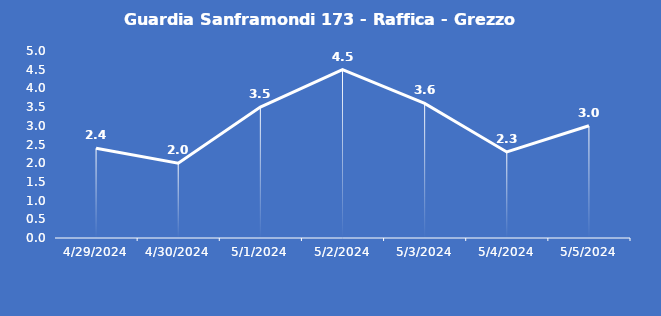
| Category | Guardia Sanframondi 173 - Raffica - Grezzo (m/s) |
|---|---|
| 4/29/24 | 2.4 |
| 4/30/24 | 2 |
| 5/1/24 | 3.5 |
| 5/2/24 | 4.5 |
| 5/3/24 | 3.6 |
| 5/4/24 | 2.3 |
| 5/5/24 | 3 |